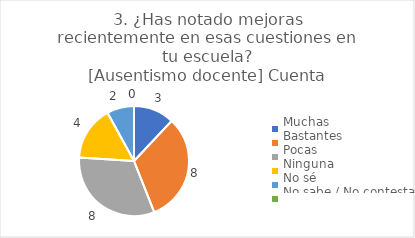
| Category | 3. ¿Has notado mejoras recientemente en esas cuestiones en tu escuela?
[Ausentismo docente] |
|---|---|
| Muchas  | 0.12 |
| Bastantes  | 0.32 |
| Pocas  | 0.32 |
| Ninguna  | 0.16 |
| No sé  | 0.08 |
| No sabe / No contesta | 0 |